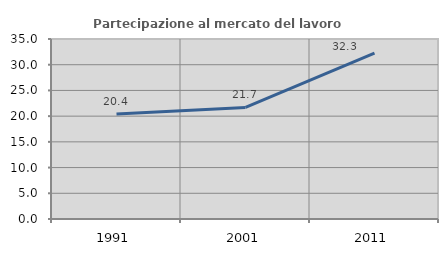
| Category | Partecipazione al mercato del lavoro  femminile |
|---|---|
| 1991.0 | 20.43 |
| 2001.0 | 21.687 |
| 2011.0 | 32.258 |